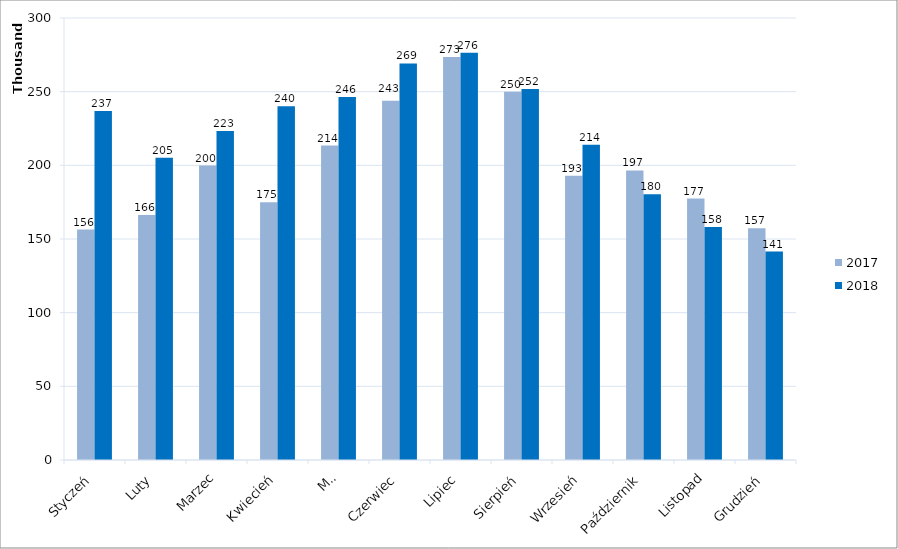
| Category | 2017 | 2018 |
|---|---|---|
| Styczeń | 156370 | 236874 |
| Luty | 166230 | 205150 |
| Marzec | 199869 | 223339 |
| Kwiecień | 174972 | 240095 |
| Maj | 213398 | 246435 |
| Czerwiec | 243771 | 269185 |
| Lipiec | 273477 | 276470 |
| Sierpień | 249888 | 251865 |
| Wrzesień | 192866 | 213979 |
| Październik | 196553 | 180295 |
| Listopad | 177407 | 158188 |
| Grudzień | 157312 | 141462 |